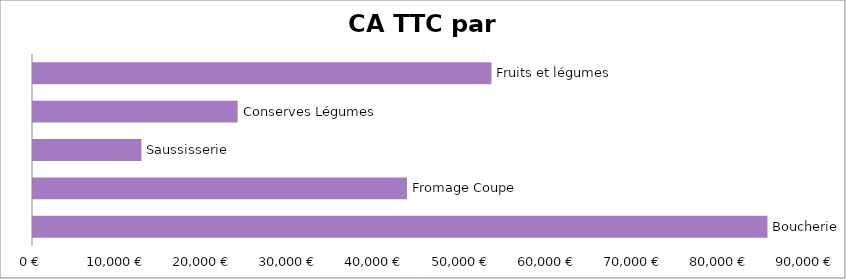
| Category | Series 0 |
|---|---|
| Boucherie | 85292.53 |
| Fromage Coupe | 43429.075 |
| Saussisserie | 12586.15 |
| Conserves Légumes | 23764.93 |
| Fruits et légumes | 53242.685 |